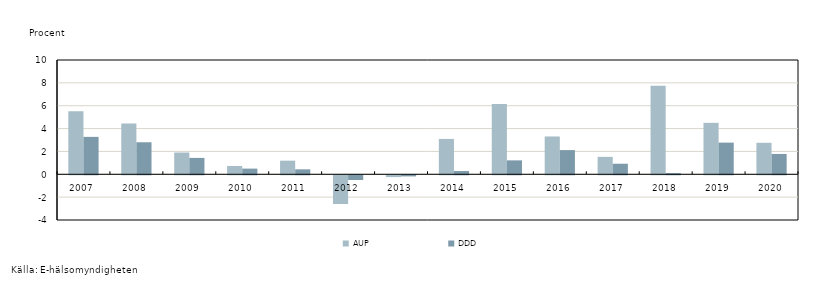
| Category | AUP | DDD |
|---|---|---|
| 2007.0 | 5.52 | 3.273 |
| 2008.0 | 4.445 | 2.803 |
| 2009.0 | 1.905 | 1.433 |
| 2010.0 | 0.727 | 0.495 |
| 2011.0 | 1.19 | 0.432 |
| 2012.0 | -2.514 | -0.414 |
| 2013.0 | -0.158 | -0.098 |
| 2014.0 | 3.093 | 0.285 |
| 2015.0 | 6.142 | 1.217 |
| 2016.0 | 3.308 | 2.117 |
| 2017.0 | 1.524 | 0.923 |
| 2018.0 | 7.737 | 0.103 |
| 2019.0 | 4.499 | 2.769 |
| 2020.0 | 2.753 | 1.779 |